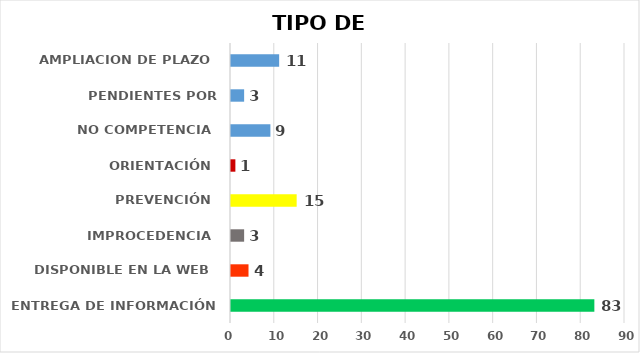
| Category | CANTIDAD DE RESPUESTAS |
|---|---|
| ENTREGA DE INFORMACIÓN | 83 |
| DISPONIBLE EN LA WEB | 4 |
| IMPROCEDENCIA | 3 |
| PREVENCIÓN | 15 |
| ORIENTACIÓN | 1 |
| NO COMPETENCIA | 9 |
| PENDIENTES POR CONTESTAR | 3 |
| AMPLIACION DE PLAZO | 11 |